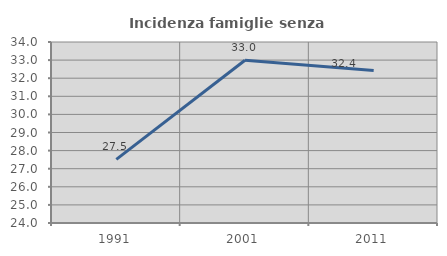
| Category | Incidenza famiglie senza nuclei |
|---|---|
| 1991.0 | 27.513 |
| 2001.0 | 32.992 |
| 2011.0 | 32.426 |